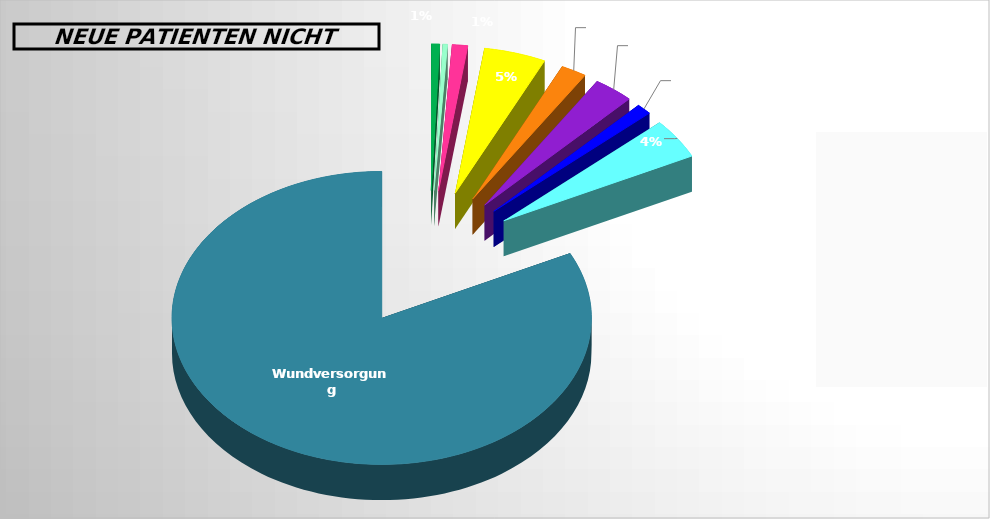
| Category | Series 0 |
|---|---|
| Neoblase /Ersatzblase | 0.007 |
| Pouch-Blase | 0.004 |
| Nephrostoma | 0.012 |
| Urin-Inkontinenz | 0.048 |
| Intermittierender Selbstkatheterismus(ISK) | 0.02 |
| Stuhl-Inkontinenz | 0.031 |
| Gastro / Jejunostoma | 0.012 |
| Fisteln / Drainage | 0.044 |
| Wundversorgung | 0.823 |